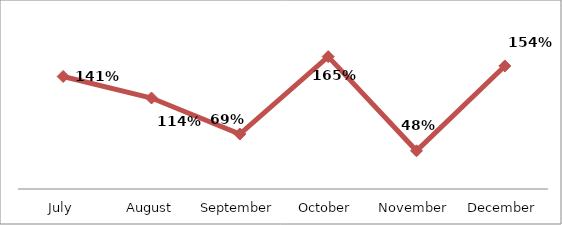
| Category | PERCENTAGE |
|---|---|
| July | 1.407 |
| August | 1.137 |
| September | 0.687 |
| October | 1.655 |
| November | 0.477 |
| December | 1.538 |